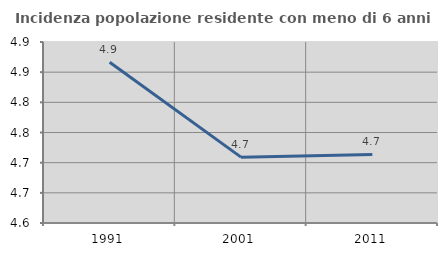
| Category | Incidenza popolazione residente con meno di 6 anni |
|---|---|
| 1991.0 | 4.866 |
| 2001.0 | 4.709 |
| 2011.0 | 4.714 |